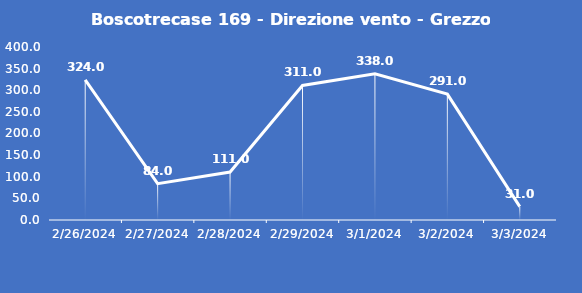
| Category | Boscotrecase 169 - Direzione vento - Grezzo (°N) |
|---|---|
| 2/26/24 | 324 |
| 2/27/24 | 84 |
| 2/28/24 | 111 |
| 2/29/24 | 311 |
| 3/1/24 | 338 |
| 3/2/24 | 291 |
| 3/3/24 | 31 |